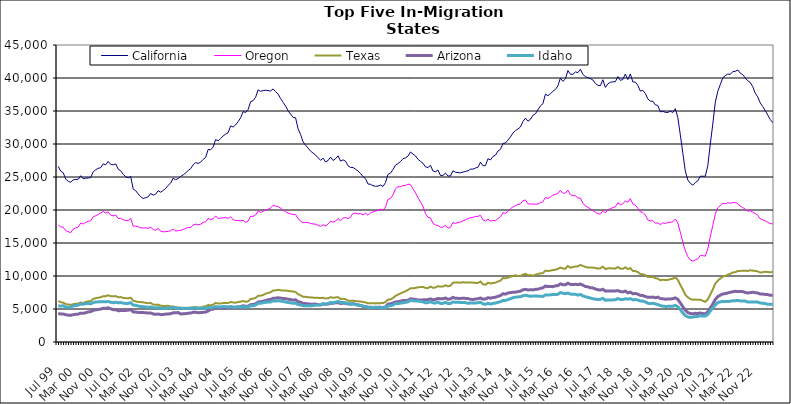
| Category | California | Oregon | Texas | Arizona | Idaho |
|---|---|---|---|---|---|
| Jul 99 | 26605 | 17749 | 6209 | 4339 | 5471 |
| Aug 99 | 25882 | 17447 | 6022 | 4228 | 5444 |
| Sep 99 | 25644 | 17401 | 5941 | 4237 | 5488 |
| Oct 99 | 24669 | 16875 | 5751 | 4134 | 5279 |
| Nov 99 | 24353 | 16701 | 5680 | 4073 | 5260 |
| Dec 99 | 24218 | 16570 | 5619 | 4042 | 5269 |
| Jan 00 | 24574 | 17109 | 5736 | 4142 | 5485 |
| Feb 00 | 24620 | 17295 | 5789 | 4192 | 5530 |
| Mar 00 | 24655 | 17436 | 5826 | 4226 | 5590 |
| Apr 00 | 25195 | 18009 | 5980 | 4375 | 5748 |
| May 00 | 24730 | 17875 | 5897 | 4337 | 5729 |
| Jun 00 | 24825 | 18113 | 6070 | 4444 | 5853 |
| Jul 00 | 24857 | 18294 | 6163 | 4555 | 5824 |
| Aug 00 | 24913 | 18376 | 6199 | 4603 | 5788 |
| Sep 00 | 25792 | 18971 | 6529 | 4804 | 5976 |
| Oct 00 | 26106 | 19135 | 6643 | 4870 | 6058 |
| Nov 00 | 26315 | 19306 | 6705 | 4926 | 6085 |
| Dec 00 | 26415 | 19570 | 6793 | 4991 | 6096 |
| Jan 01 | 26995 | 19781 | 6942 | 5122 | 6119 |
| Feb 01 | 26851 | 19519 | 6948 | 5089 | 6090 |
| Mar 01 | 27352 | 19720 | 7080 | 5180 | 6143 |
| Apr 01 | 26918 | 19221 | 6943 | 5020 | 6020 |
| May 01 | 26848 | 19126 | 6924 | 4899 | 5950 |
| Jun 01 | 26974 | 19241 | 6959 | 4895 | 6019 |
| Jul 01 | 26172 | 18725 | 6778 | 4737 | 5951 |
| Aug 01 | 25943 | 18736 | 6810 | 4757 | 5973 |
| Sep 01 | 25399 | 18514 | 6688 | 4753 | 5895 |
| Oct 01 | 25050 | 18415 | 6650 | 4780 | 5833 |
| Nov 01 | 24873 | 18381 | 6631 | 4826 | 5850 |
| Dec 01 | 25099 | 18765 | 6708 | 4898 | 5969 |
| Jan 02 | 23158 | 17561 | 6261 | 4560 | 5595 |
| Feb 02 | 22926 | 17573 | 6162 | 4531 | 5560 |
| Mar 02 | 22433 | 17452 | 6052 | 4481 | 5458 |
| Apr 02 | 22012 | 17314 | 6046 | 4458 | 5380 |
| May 02 | 21733 | 17267 | 6007 | 4452 | 5358 |
| Jun 02 | 21876 | 17298 | 5933 | 4444 | 5315 |
| Jul 02 | 21997 | 17209 | 5873 | 4383 | 5243 |
| Aug 02 | 22507 | 17436 | 5929 | 4407 | 5315 |
| Sep 02 | 22244 | 17010 | 5672 | 4248 | 5192 |
| Oct 02 | 22406 | 16952 | 5625 | 4191 | 5167 |
| Nov 02 | 22922 | 17223 | 5663 | 4242 | 5221 |
| Dec 02 | 22693 | 16770 | 5499 | 4142 | 5120 |
| Jan 03 | 22964 | 16694 | 5463 | 4166 | 5089 |
| Feb 03 | 23276 | 16727 | 5461 | 4226 | 5077 |
| Mar 03 | 23736 | 16766 | 5486 | 4251 | 5145 |
| Apr 03 | 24079 | 16859 | 5389 | 4289 | 5145 |
| May 03 | 24821 | 17117 | 5378 | 4415 | 5254 |
| Jun 03 | 24592 | 16812 | 5273 | 4426 | 5135 |
| Jul 03 | 24754 | 16875 | 5226 | 4466 | 5124 |
| Aug 03 | 25092 | 16922 | 5181 | 4244 | 5100 |
| Sep 03 | 25316 | 17036 | 5181 | 4279 | 5086 |
| Oct 03 | 25622 | 17228 | 5139 | 4301 | 5110 |
| Nov 03 | 25984 | 17335 | 5175 | 4362 | 5091 |
| Dec 03 | 26269 | 17350 | 5189 | 4396 | 5113 |
| Jan 04 | 26852 | 17734 | 5255 | 4492 | 5152 |
| Feb 04 | 27184 | 17860 | 5301 | 4502 | 5183 |
| Mar 04 | 27062 | 17757 | 5227 | 4443 | 5056 |
| Apr 04 | 27238 | 17840 | 5227 | 4461 | 5104 |
| May 04 | 27671 | 18113 | 5345 | 4493 | 5095 |
| Jun 04 | 27949 | 18201 | 5416 | 4532 | 5103 |
| Jul 04 | 29172 | 18727 | 5597 | 4697 | 5231 |
| Aug 04 | 29122 | 18529 | 5561 | 4945 | 5197 |
| Sep 04 | 29542 | 18678 | 5656 | 4976 | 5237 |
| Oct 04 | 30674 | 19108 | 5922 | 5188 | 5363 |
| Nov 04 | 30472 | 18716 | 5823 | 5106 | 5321 |
| Dec 04 | 30831 | 18755 | 5838 | 5135 | 5312 |
| Jan 05 | 31224 | 18823 | 5906 | 5155 | 5374 |
| Feb 05 | 31495 | 18842 | 5898 | 5168 | 5357 |
| Mar 05 | 31714 | 18738 | 5894 | 5212 | 5313 |
| Apr 05 | 32750 | 18998 | 6060 | 5340 | 5350 |
| May 05 | 32575 | 18504 | 5989 | 5269 | 5276 |
| Jun 05 | 32898 | 18414 | 5954 | 5252 | 5271 |
| Jul 05 | 33384 | 18395 | 6062 | 5322 | 5322 |
| Aug 05 | 33964 | 18381 | 6113 | 5375 | 5316 |
| Sep 05 | 34897 | 18426 | 6206 | 5493 | 5362 |
| Oct 05 | 34780 | 18132 | 6100 | 5408 | 5308 |
| Nov 05 | 35223 | 18332 | 6162 | 5434 | 5314 |
| Dec 05 | 36415 | 19047 | 6508 | 5658 | 5487 |
| Jan 06 | 36567 | 19032 | 6576 | 5688 | 5480 |
| Feb 06 | 37074 | 19257 | 6692 | 5792 | 5616 |
| Mar 06 | 38207 | 19845 | 6993 | 6052 | 5850 |
| Apr 06 | 37976 | 19637 | 7024 | 6101 | 5864 |
| May 06 | 38099 | 19781 | 7114 | 6178 | 5943 |
| Jun 06 | 38141 | 20061 | 7331 | 6276 | 6018 |
| Jul 06 | 38097 | 20111 | 7431 | 6399 | 6046 |
| Aug 06 | 38021 | 20333 | 7542 | 6450 | 6064 |
| Sep 06 | 38349 | 20686 | 7798 | 6627 | 6232 |
| Oct 06 | 37947 | 20591 | 7825 | 6647 | 6216 |
| Nov 06 | 37565 | 20526 | 7907 | 6707 | 6244 |
| Dec 06 | 36884 | 20272 | 7840 | 6648 | 6192 |
| Jan 07 | 36321 | 19984 | 7789 | 6597 | 6151 |
| Feb 07 | 35752 | 19752 | 7799 | 6554 | 6048 |
| Mar 07 | 35025 | 19547 | 7737 | 6487 | 5989 |
| Apr 07 | 34534 | 19412 | 7685 | 6430 | 5937 |
| May 07 | 34022 | 19296 | 7654 | 6353 | 5858 |
| Jun 07 | 33974 | 19318 | 7577 | 6390 | 5886 |
| Jul 07 | 32298 | 18677 | 7250 | 6117 | 5682 |
| Aug 07 | 31436 | 18322 | 7070 | 6034 | 5617 |
| Sep 07 | 30331 | 18087 | 6853 | 5847 | 5500 |
| Oct 07 | 29813 | 18108 | 6839 | 5821 | 5489 |
| Nov 07 | 29384 | 18105 | 6777 | 5769 | 5481 |
| Dec 07 | 28923 | 17949 | 6760 | 5733 | 5499 |
| Jan 08 | 28627 | 17890 | 6721 | 5732 | 5521 |
| Feb 08 | 28328 | 17834 | 6719 | 5749 | 5579 |
| Mar 08 | 27911 | 17680 | 6690 | 5650 | 5614 |
| Apr 08 | 27543 | 17512 | 6656 | 5612 | 5635 |
| May 08 | 27856 | 17754 | 6705 | 5774 | 5798 |
| Jun 08 | 27287 | 17589 | 6593 | 5717 | 5745 |
| Jul 08 | 27495 | 17834 | 6623 | 5761 | 5807 |
| Aug 08 | 28018 | 18309 | 6789 | 5867 | 5982 |
| Sep-08 | 27491 | 18164 | 6708 | 5864 | 5954 |
| Oct 08 | 27771 | 18291 | 6755 | 5942 | 6032 |
| Nov 08 | 28206 | 18706 | 6787 | 5970 | 6150 |
| Dec 08 | 27408 | 18353 | 6505 | 5832 | 5975 |
| Jan 09 | 27601 | 18778 | 6569 | 5890 | 5995 |
| Feb 09 | 27394 | 18863 | 6483 | 5845 | 5936 |
| Mar 09 | 26690 | 18694 | 6273 | 5751 | 5806 |
| Apr 09 | 26461 | 18943 | 6222 | 5735 | 5777 |
| May 09 | 26435 | 19470 | 6272 | 5819 | 5767 |
| Jun 09 | 26187 | 19522 | 6199 | 5700 | 5649 |
| Jul 09 | 25906 | 19408 | 6171 | 5603 | 5617 |
| Aug 09 | 25525 | 19469 | 6128 | 5533 | 5540 |
| Sep 09 | 25050 | 19249 | 6059 | 5405 | 5437 |
| Oct 09 | 24741 | 19529 | 6004 | 5349 | 5369 |
| Nov 09 | 23928 | 19187 | 5854 | 5271 | 5248 |
| Dec 09 | 23899 | 19607 | 5886 | 5261 | 5195 |
| Jan 10 | 23676 | 19703 | 5881 | 5232 | 5234 |
| Feb 10 | 23592 | 19845 | 5850 | 5272 | 5236 |
| Mar 10 | 23634 | 19946 | 5864 | 5278 | 5219 |
| Apr 10 | 23774 | 20134 | 5889 | 5257 | 5201 |
| May 10 | 23567 | 19966 | 5897 | 5172 | 5105 |
| Jun 10 | 24166 | 20464 | 6087 | 5356 | 5237 |
| Jul 10 | 25410 | 21627 | 6417 | 5742 | 5452 |
| Aug 10 | 25586 | 21744 | 6465 | 5797 | 5491 |
| Sep 10 | 26150 | 22314 | 6667 | 5907 | 5609 |
| Oct 10 | 26807 | 23219 | 6986 | 6070 | 5831 |
| Nov 10 | 27033 | 23520 | 7179 | 6100 | 5810 |
| Dec 10 | 27332 | 23551 | 7361 | 6182 | 5898 |
| Jan 11 | 27769 | 23697 | 7525 | 6276 | 5938 |
| Feb 11 | 27898 | 23718 | 7708 | 6267 | 6016 |
| Mar 11 | 28155 | 23921 | 7890 | 6330 | 6081 |
| Apr 11 | 28790 | 23847 | 8146 | 6544 | 6305 |
| May 11 | 28471 | 23215 | 8131 | 6502 | 6248 |
| Jun 11 | 28191 | 22580 | 8199 | 6445 | 6217 |
| Jul 11 | 27678 | 21867 | 8291 | 6368 | 6202 |
| Aug 11 | 27372 | 21203 | 8321 | 6356 | 6146 |
| Sep 11 | 27082 | 20570 | 8341 | 6387 | 6075 |
| Oct 11 | 26528 | 19442 | 8191 | 6402 | 5932 |
| Nov 11 | 26440 | 18872 | 8176 | 6426 | 5968 |
| Dec 11 | 26770 | 18784 | 8401 | 6533 | 6106 |
| Jan 12 | 25901 | 17963 | 8202 | 6390 | 5933 |
| Feb 12 | 25796 | 17718 | 8266 | 6456 | 5900 |
| Mar 12 | 26042 | 17647 | 8456 | 6600 | 6054 |
| Apr 12 | 25239 | 17386 | 8388 | 6534 | 5838 |
| May 12 | 25238 | 17407 | 8401 | 6558 | 5854 |
| Jun 12 | 25593 | 17673 | 8594 | 6669 | 6009 |
| Jul 12 | 25155 | 17237 | 8432 | 6474 | 5817 |
| Aug 12 | 25146 | 17391 | 8536 | 6539 | 5842 |
| Sep 12 | 25942 | 18102 | 8989 | 6759 | 6061 |
| Oct 12 | 25718 | 17953 | 9012 | 6618 | 6027 |
| Nov 12 | 25677 | 18134 | 9032 | 6611 | 6009 |
| Dec 12 | 25619 | 18166 | 8981 | 6601 | 5999 |
| Jan 13 | 25757 | 18344 | 9051 | 6627 | 5989 |
| Feb-13 | 25830 | 18512 | 9001 | 6606 | 5968 |
| Mar-13 | 25940 | 18689 | 9021 | 6577 | 5853 |
| Apr 13 | 26187 | 18844 | 9013 | 6478 | 5925 |
| May 13 | 26192 | 18884 | 9003 | 6431 | 5924 |
| Jun-13 | 26362 | 19013 | 8948 | 6508 | 5896 |
| Jul 13 | 26467 | 19037 | 8958 | 6559 | 5948 |
| Aug 13 | 27253 | 19198 | 9174 | 6655 | 6020 |
| Sep 13 | 26711 | 18501 | 8747 | 6489 | 5775 |
| Oct 13 | 26733 | 18301 | 8681 | 6511 | 5711 |
| Nov 13 | 27767 | 18620 | 8989 | 6709 | 5860 |
| Dec 13 | 27583 | 18320 | 8863 | 6637 | 5740 |
| Jan 14 | 28107 | 18409 | 8939 | 6735 | 5843 |
| Feb-14 | 28313 | 18383 | 8989 | 6779 | 5893 |
| Mar 14 | 28934 | 18696 | 9160 | 6918 | 6015 |
| Apr 14 | 29192 | 18946 | 9291 | 7036 | 6099 |
| May 14 | 30069 | 19603 | 9701 | 7314 | 6304 |
| Jun 14 | 30163 | 19487 | 9641 | 7252 | 6293 |
| Jul-14 | 30587 | 19754 | 9752 | 7415 | 6427 |
| Aug-14 | 31074 | 20201 | 9882 | 7499 | 6557 |
| Sep 14 | 31656 | 20459 | 9997 | 7536 | 6719 |
| Oct 14 | 32037 | 20663 | 10109 | 7555 | 6786 |
| Nov 14 | 32278 | 20825 | 9992 | 7628 | 6831 |
| Dec 14 | 32578 | 20918 | 10006 | 7705 | 6860 |
| Jan 15 | 33414 | 21396 | 10213 | 7906 | 7000 |
| Feb 15 | 33922 | 21518 | 10337 | 7982 | 7083 |
| Mar 15 | 33447 | 20942 | 10122 | 7891 | 7006 |
| Apr-15 | 33731 | 20893 | 10138 | 7906 | 6931 |
| May 15 | 34343 | 20902 | 10053 | 7895 | 6952 |
| Jun-15 | 34572 | 20870 | 10192 | 7973 | 6966 |
| Jul 15 | 35185 | 20916 | 10303 | 8000 | 6949 |
| Aug 15 | 35780 | 21115 | 10399 | 8126 | 6938 |
| Sep 15 | 36109 | 21246 | 10428 | 8207 | 6896 |
| Oct 15 | 37555 | 21908 | 10813 | 8477 | 7140 |
| Nov 15 | 37319 | 21750 | 10763 | 8390 | 7112 |
| Dec 15 | 37624 | 21990 | 10807 | 8395 | 7149 |
| Jan 16 | 37978 | 22248 | 10892 | 8388 | 7201 |
| Feb 16 | 38285 | 22369 | 10951 | 8508 | 7192 |
| Mar 16 | 38792 | 22506 | 11075 | 8547 | 7226 |
| Apr 16 | 39994 | 22999 | 11286 | 8815 | 7487 |
| May 16 | 39488 | 22548 | 11132 | 8673 | 7382 |
| Jun 16 | 39864 | 22556 | 11100 | 8682 | 7315 |
| Jul 16 | 41123 | 22989 | 11516 | 8903 | 7420 |
| Aug 16 | 40573 | 22333 | 11251 | 8731 | 7261 |
| Sep 16 | 40560 | 22162 | 11340 | 8692 | 7216 |
| Oct 16 | 40923 | 22172 | 11456 | 8742 | 7233 |
| Nov 16 | 40817 | 21818 | 11459 | 8685 | 7101 |
| Dec 16 | 41311 | 21815 | 11681 | 8783 | 7203 |
| Jan 17 | 40543 | 21029 | 11524 | 8609 | 6982 |
| Feb 17 | 40218 | 20613 | 11385 | 8416 | 6852 |
| Mar 17 | 40052 | 20425 | 11276 | 8354 | 6775 |
| Apr 17 | 39913 | 20147 | 11297 | 8218 | 6653 |
| May 17 | 39695 | 19910 | 11265 | 8196 | 6552 |
| Jun 17 | 39177 | 19650 | 11225 | 8034 | 6500 |
| Jul 17 | 38901 | 19419 | 11115 | 7923 | 6429 |
| Aug 17 | 38827 | 19389 | 11168 | 7867 | 6479 |
| Sep 17 | 39736 | 19936 | 11426 | 7991 | 6609 |
| Oct 17 | 38576 | 19547 | 11041 | 7708 | 6315 |
| Nov 17 | 39108 | 20013 | 11158 | 7746 | 6381 |
| Dec 17 | 39359 | 20202 | 11185 | 7743 | 6366 |
| Jan 18 | 39420 | 20362 | 11118 | 7736 | 6380 |
| Feb 18 | 39440 | 20476 | 11128 | 7741 | 6407 |
| Mar 18 | 40218 | 21106 | 11362 | 7789 | 6578 |
| Apr 18 | 39637 | 20788 | 11111 | 7642 | 6423 |
| May 18 | 39777 | 20933 | 11097 | 7591 | 6430 |
| Jun 18 | 40602 | 21381 | 11317 | 7721 | 6554 |
| Jul 18 | 39767 | 21189 | 11038 | 7445 | 6489 |
| Aug 18 | 40608 | 21729 | 11200 | 7560 | 6569 |
| Sep 18 | 39395 | 20916 | 10772 | 7318 | 6383 |
| Oct 18 | 39383 | 20724 | 10740 | 7344 | 6429 |
| Nov 18 | 38891 | 20265 | 10605 | 7255 | 6365 |
| Dec 18 | 38013 | 19741 | 10292 | 7069 | 6205 |
| Jan 19 | 38130 | 19643 | 10261 | 7032 | 6203 |
| Feb 19 | 37658 | 19237 | 10132 | 6892 | 6073 |
| Mar 19 | 36831 | 18492 | 9848 | 6766 | 5863 |
| Apr 19 | 36492 | 18349 | 9839 | 6763 | 5827 |
| May 19 | 36481 | 18407 | 9867 | 6809 | 5873 |
| Jun 19 | 35925 | 17998 | 9661 | 6698 | 5761 |
| Jul 19 | 35843 | 18049 | 9598 | 6800 | 5673 |
| Aug 19 | 34870 | 17785 | 9361 | 6577 | 5512 |
| Sep 19 | 34945 | 18038 | 9428 | 6547 | 5437 |
| Oct 19 | 34802 | 17977 | 9385 | 6483 | 5390 |
| Nov 19 | 34775 | 18072 | 9403 | 6511 | 5401 |
| Dec 19 | 34976 | 18140 | 9518 | 6521 | 5419 |
| Jan 20 | 34774 | 18209 | 9594 | 6561 | 5434 |
| Feb 20 | 35352 | 18632 | 9804 | 6682 | 5543 |
| Mar 20 | 34013 | 18041 | 9411 | 6464 | 5330 |
| Apr 20 | 31385 | 16629 | 8666 | 5922 | 4906 |
| May 20 | 28657 | 15123 | 7927 | 5355 | 4419 |
| Jun 20 | 25915 | 13817 | 7164 | 4815 | 3992 |
| Jul 20 | 24545 | 12926 | 6776 | 4457 | 3810 |
| Aug 20 | 24048 | 12443 | 6521 | 4326 | 3720 |
| Sep 20 | 23756 | 12258 | 6386 | 4266 | 3784 |
| Oct 20 | 24166 | 12429 | 6452 | 4347 | 3861 |
| Nov 20 | 24404 | 12597 | 6386 | 4324 | 3883 |
| Dec 20 | 25120 | 13122 | 6420 | 4394 | 3974 |
| Jan 21 | 25111 | 13080 | 6236 | 4304 | 3924 |
| Feb 21 | 25114 | 13015 | 6094 | 4260 | 3930 |
| Mar 21 | 26701 | 14096 | 6455 | 4567 | 4185 |
| Apr 21 | 29998 | 15978 | 7222 | 5164 | 4697 |
| May 21 | 33020 | 17641 | 7969 | 5748 | 5148 |
| Jun 21 | 36320 | 19369 | 8840 | 6450 | 5628 |
| Jul 21 | 37989 | 20320 | 9306 | 6877 | 5984 |
| Aug 21 | 39007 | 20657 | 9615 | 7094 | 6084 |
| Sep 21 | 40023 | 20974 | 9914 | 7277 | 6151 |
| Oct 21 | 40348 | 20966 | 10003 | 7327 | 6140 |
| Nov 21 | 40599 | 21096 | 10203 | 7437 | 6136 |
| Dec 21 | 40548 | 21032 | 10328 | 7532 | 6183 |
| Jan 22 | 40967 | 21106 | 10535 | 7618 | 6237 |
| Feb 22 | 41019 | 21125 | 10579 | 7673 | 6236 |
| Mar 22 | 41220 | 20949 | 10751 | 7660 | 6310 |
| Apr 22 | 40730 | 20602 | 10772 | 7661 | 6221 |
| May 22 | 40504 | 20370 | 10792 | 7636 | 6210 |
| Jun 22 | 40013 | 20127 | 10802 | 7504 | 6199 |
| Jul 22 | 39582 | 19846 | 10761 | 7419 | 6050 |
| Aug 22 | 39321 | 19865 | 10868 | 7487 | 6071 |
| Sep 22 | 38685 | 19666 | 10811 | 7536 | 6074 |
| Oct 22 | 37700 | 19450 | 10764 | 7469 | 6042 |
| Nov 22 | 37133 | 19198 | 10701 | 7425 | 6042 |
| Dec 22 | 36232 | 18659 | 10527 | 7261 | 5898 |
| Jan 23 | 35674 | 18528 | 10578 | 7263 | 5879 |
| Feb 23 | 35072 | 18344 | 10642 | 7211 | 5827 |
| Mar 23 | 34396 | 18133 | 10609 | 7183 | 5713 |
| Apr 23 | 33708 | 17931 | 10559 | 7074 | 5706 |
| May 23 | 33245 | 17904 | 10624 | 7091 | 5712 |